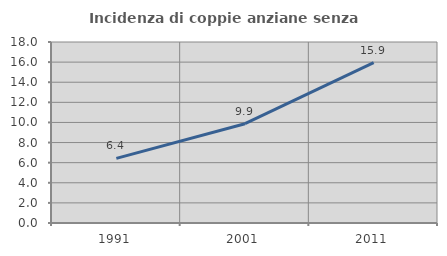
| Category | Incidenza di coppie anziane senza figli  |
|---|---|
| 1991.0 | 6.423 |
| 2001.0 | 9.874 |
| 2011.0 | 15.94 |